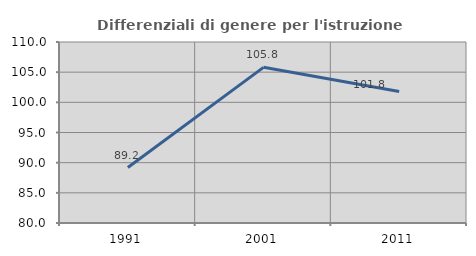
| Category | Differenziali di genere per l'istruzione superiore |
|---|---|
| 1991.0 | 89.196 |
| 2001.0 | 105.801 |
| 2011.0 | 101.803 |